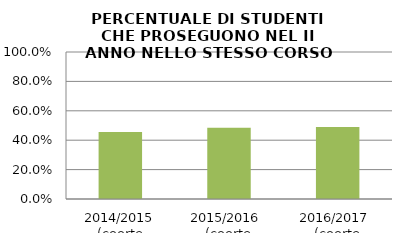
| Category | 2014/2015 (coorte 2013/14) 2015/2016  (coorte 2014/15) 2016/2017  (coorte 2015/16) |
|---|---|
| 2014/2015 (coorte 2013/14) | 0.457 |
| 2015/2016  (coorte 2014/15) | 0.484 |
| 2016/2017  (coorte 2015/16) | 0.491 |